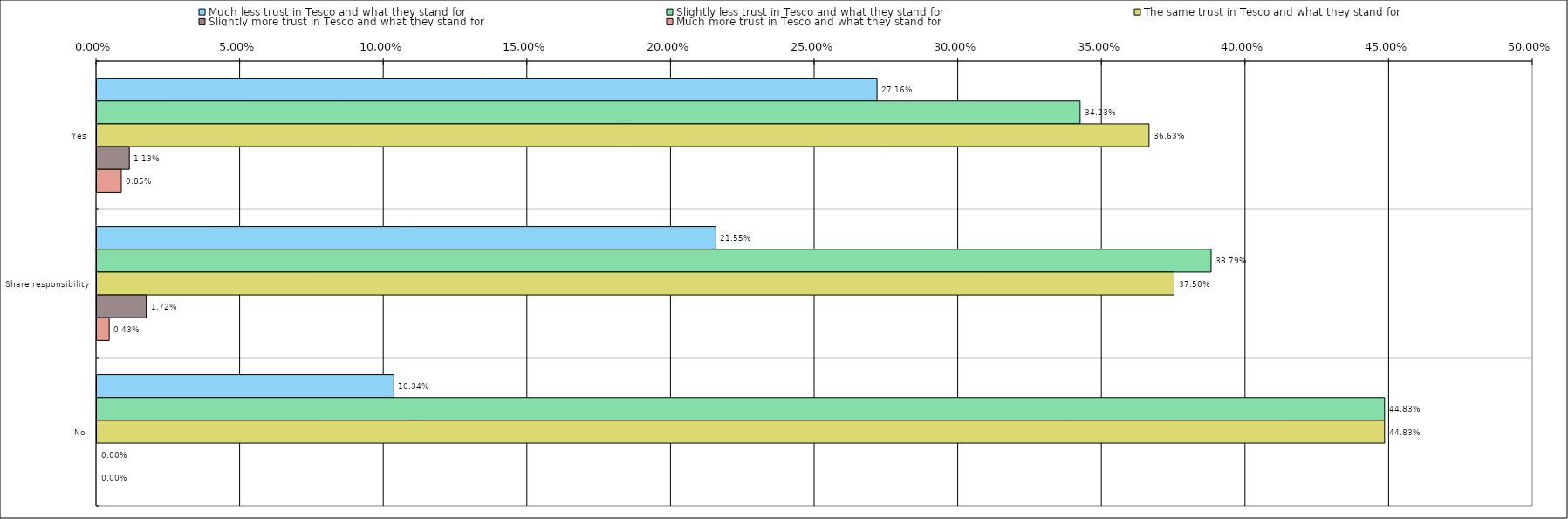
| Category | Much less trust in Tesco and what they stand for | Slightly less trust in Tesco and what they stand for | The same trust in Tesco and what they stand for | Slightly more trust in Tesco and what they stand for | Much more trust in Tesco and what they stand for |
|---|---|---|---|---|---|
| 0 | 0.272 | 0.342 | 0.366 | 0.011 | 0.008 |
| 1 | 0.216 | 0.388 | 0.375 | 0.017 | 0.004 |
| 2 | 0.103 | 0.448 | 0.448 | 0 | 0 |